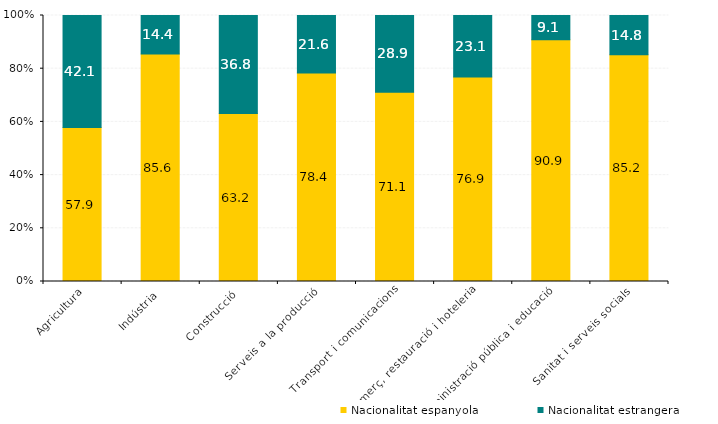
| Category | Nacionalitat espanyola | Nacionalitat estrangera |
|---|---|---|
| Agricultura | 57.851 | 42.149 |
| Indústria | 85.559 | 14.441 |
| Construcció | 63.156 | 36.844 |
| Serveis a la producció | 78.371 | 21.629 |
| Transport i comunicacions | 71.131 | 28.869 |
| Comerç, restauració i hoteleria | 76.883 | 23.117 |
| Administració pública i educació | 90.928 | 9.072 |
| Sanitat i serveis socials | 85.198 | 14.802 |